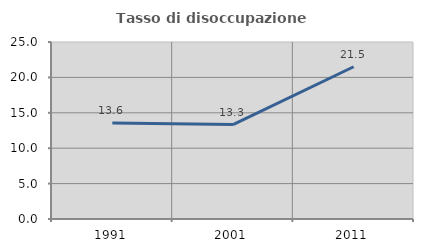
| Category | Tasso di disoccupazione giovanile  |
|---|---|
| 1991.0 | 13.571 |
| 2001.0 | 13.333 |
| 2011.0 | 21.505 |